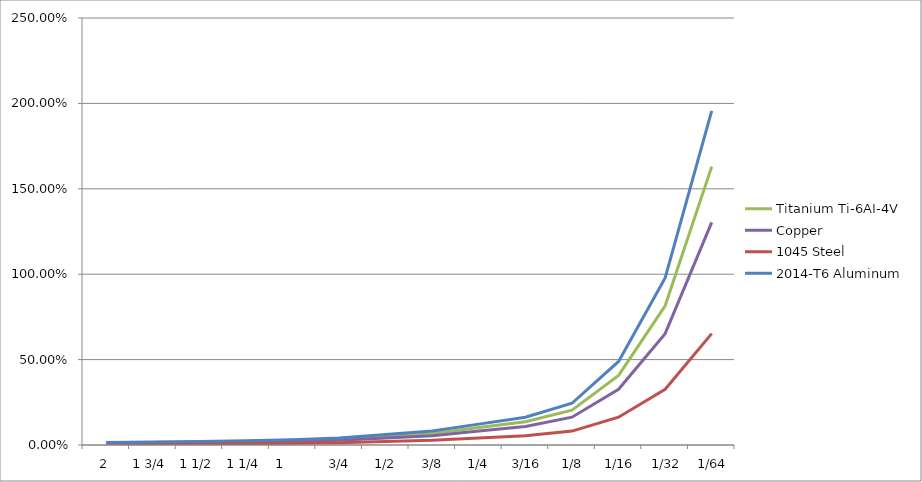
| Category | Titanium Ti-6AI-4V | Copper | 1045 Steel | 2014-T6 Aluminum |
|---|---|---|---|---|
| 2.0 | 0.013 | 0.01 | 0.005 | 0.015 |
| 1.75 | 0.015 | 0.012 | 0.006 | 0.017 |
| 1.5 | 0.017 | 0.014 | 0.007 | 0.02 |
| 1.25 | 0.02 | 0.016 | 0.008 | 0.024 |
| 1.0 | 0.025 | 0.02 | 0.01 | 0.031 |
| 0.75 | 0.034 | 0.027 | 0.014 | 0.041 |
| 0.5 | 0.051 | 0.041 | 0.02 | 0.061 |
| 0.375 | 0.068 | 0.054 | 0.027 | 0.081 |
| 0.25 | 0.102 | 0.081 | 0.041 | 0.122 |
| 0.1875 | 0.136 | 0.109 | 0.054 | 0.163 |
| 0.125 | 0.204 | 0.163 | 0.081 | 0.244 |
| 0.0625 | 0.407 | 0.326 | 0.163 | 0.489 |
| 0.03125 | 0.815 | 0.652 | 0.326 | 0.978 |
| 0.015625 | 1.63 | 1.304 | 0.652 | 1.956 |